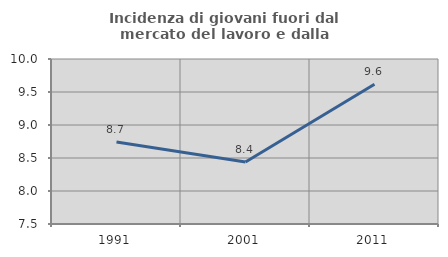
| Category | Incidenza di giovani fuori dal mercato del lavoro e dalla formazione  |
|---|---|
| 1991.0 | 8.743 |
| 2001.0 | 8.441 |
| 2011.0 | 9.618 |